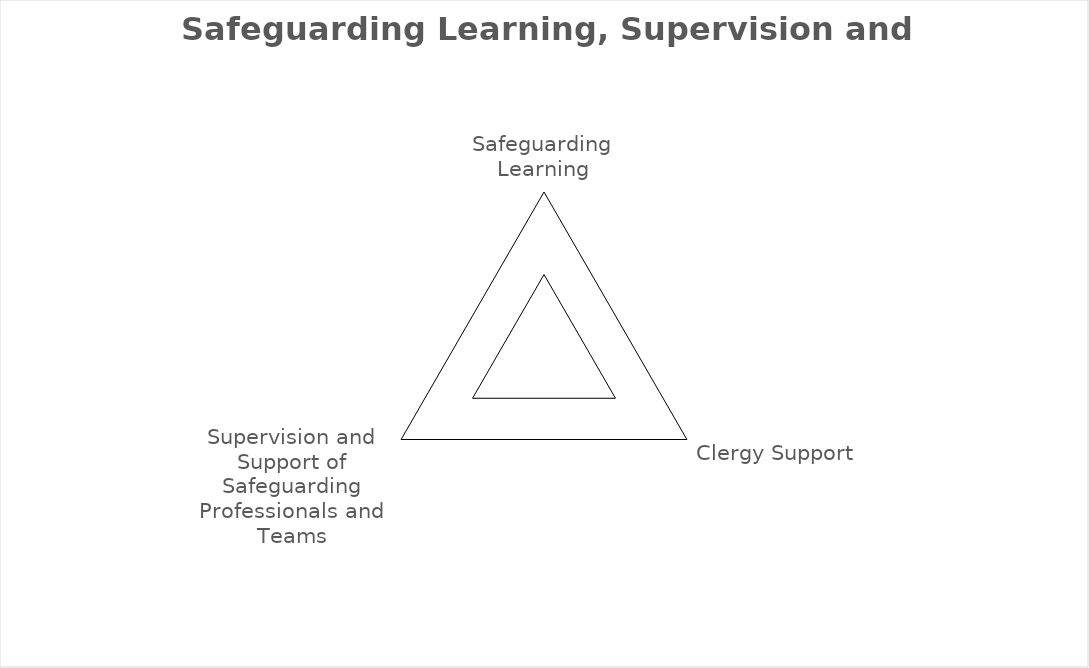
| Category | Series 0 |
|---|---|
| Safeguarding Learning | 0 |
| Clergy Support | 0 |
| Supervision and Support of Safeguarding Professionals and Teams | 0 |